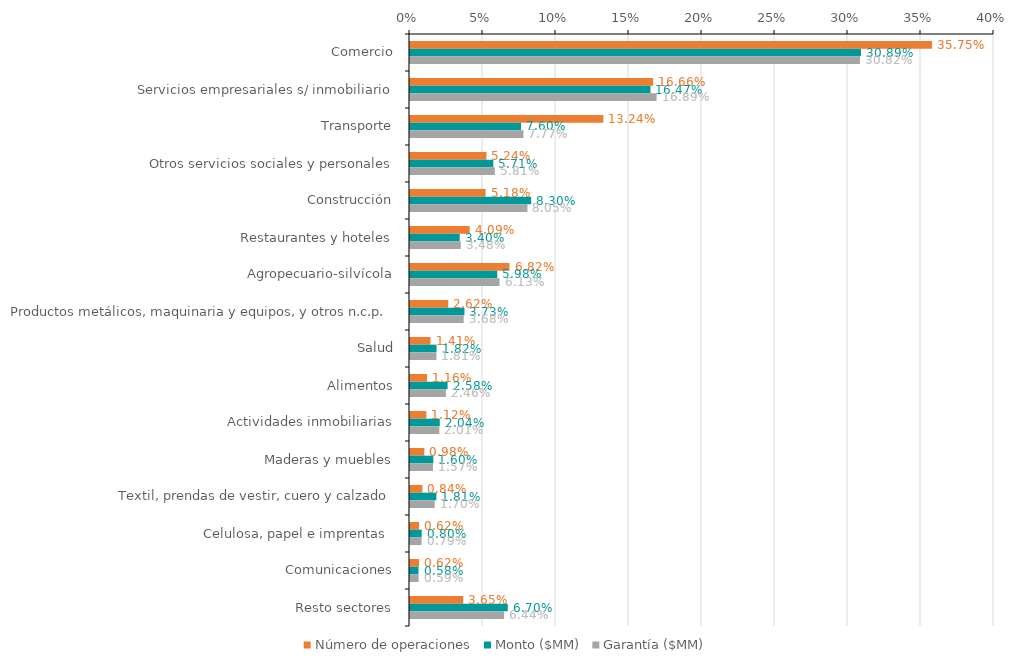
| Category | Número de operaciones | Monto ($MM) | Garantía ($MM) |
|---|---|---|---|
| Comercio | 0.358 | 0.309 | 0.308 |
| Servicios empresariales s/ inmobiliario | 0.167 | 0.165 | 0.169 |
| Transporte | 0.132 | 0.076 | 0.078 |
| Otros servicios sociales y personales | 0.052 | 0.057 | 0.058 |
| Construcción | 0.052 | 0.083 | 0.08 |
| Restaurantes y hoteles | 0.041 | 0.034 | 0.035 |
| Agropecuario-silvícola | 0.068 | 0.06 | 0.061 |
| Productos metálicos, maquinaria y equipos, y otros n.c.p. | 0.026 | 0.037 | 0.037 |
| Salud | 0.014 | 0.018 | 0.018 |
| Alimentos | 0.012 | 0.026 | 0.025 |
| Actividades inmobiliarias | 0.011 | 0.02 | 0.02 |
| Maderas y muebles | 0.01 | 0.016 | 0.016 |
| Textil, prendas de vestir, cuero y calzado | 0.008 | 0.018 | 0.017 |
| Celulosa, papel e imprentas  | 0.006 | 0.008 | 0.008 |
| Comunicaciones | 0.006 | 0.006 | 0.006 |
| Resto sectores | 0.036 | 0.067 | 0.064 |